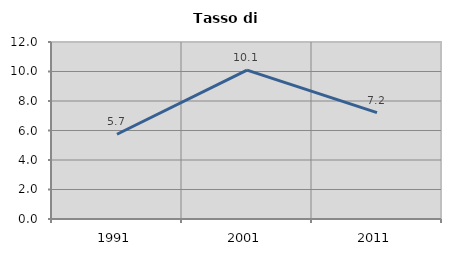
| Category | Tasso di disoccupazione   |
|---|---|
| 1991.0 | 5.747 |
| 2001.0 | 10.092 |
| 2011.0 | 7.207 |